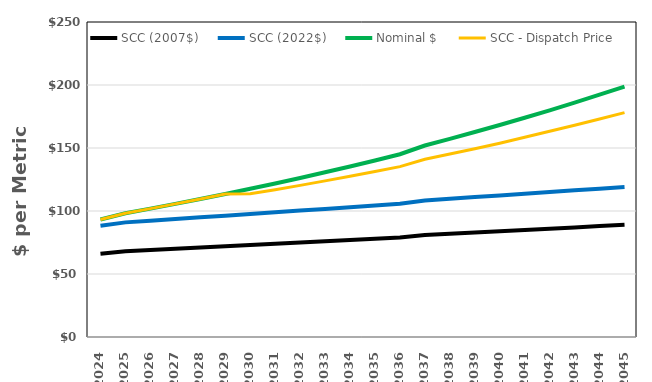
| Category | SCC (2007$) | SCC (2022$) | Nominal $ | SCC - Dispatch Price |
|---|---|---|---|---|
| 2024.0 | 66 | 88.296 | 93.239 | 93.239 |
| 2025.0 | 68 | 90.971 | 98.21 | 98.21 |
| 2026.0 | 69 | 92.309 | 101.88 | 101.88 |
| 2027.0 | 70 | 93.647 | 105.665 | 105.665 |
| 2028.0 | 71 | 94.985 | 109.532 | 109.532 |
| 2029.0 | 72 | 96.323 | 113.518 | 113.518 |
| 2030.0 | 73 | 97.66 | 117.627 | 113.627 |
| 2031.0 | 74 | 98.998 | 121.862 | 116.852 |
| 2032.0 | 75 | 100.336 | 126.226 | 120.326 |
| 2033.0 | 76 | 101.674 | 130.723 | 123.903 |
| 2034.0 | 77 | 103.012 | 135.357 | 127.567 |
| 2035.0 | 78 | 104.349 | 140.131 | 131.341 |
| 2036.0 | 79 | 105.687 | 145.05 | 135.21 |
| 2037.0 | 81 | 108.363 | 151.994 | 141.064 |
| 2038.0 | 82 | 109.701 | 157.256 | 145.196 |
| 2039.0 | 83 | 111.038 | 162.675 | 149.425 |
| 2040.0 | 84 | 112.376 | 168.257 | 153.777 |
| 2041.0 | 85 | 113.714 | 174.006 | 158.466 |
| 2042.0 | 86 | 115.052 | 179.926 | 163.236 |
| 2043.0 | 87 | 116.39 | 186.023 | 168.093 |
| 2044.0 | 88 | 117.728 | 192.3 | 173.04 |
| 2045.0 | 89 | 119.065 | 198.764 | 178.074 |